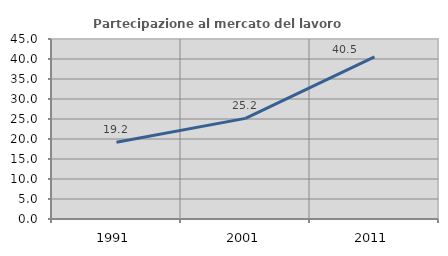
| Category | Partecipazione al mercato del lavoro  femminile |
|---|---|
| 1991.0 | 19.167 |
| 2001.0 | 25.161 |
| 2011.0 | 40.506 |